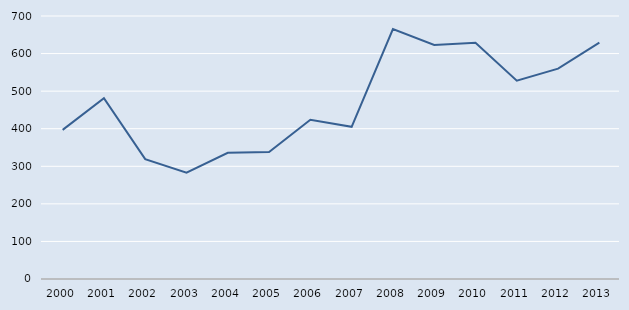
| Category | Series 0 |
|---|---|
| 2000.0 | 397 |
| 2001.0 | 481 |
| 2002.0 | 319 |
| 2003.0 | 283 |
| 2004.0 | 336 |
| 2005.0 | 338 |
| 2006.0 | 424 |
| 2007.0 | 405 |
| 2008.0 | 665 |
| 2009.0 | 623 |
| 2010.0 | 629 |
| 2011.0 | 528 |
| 2012.0 | 560 |
| 2013.0 | 629 |